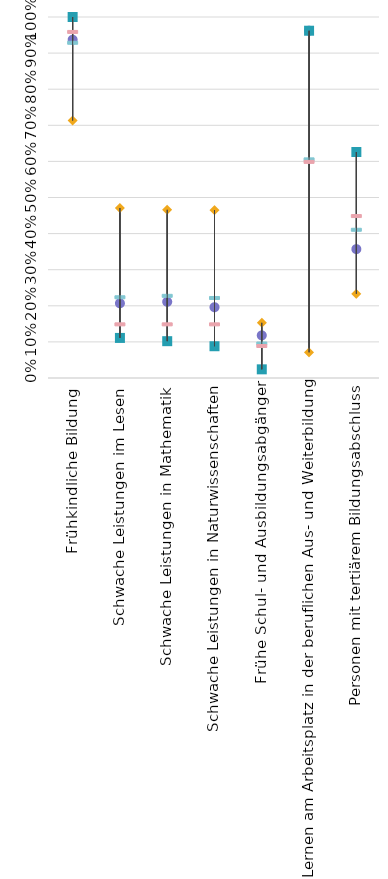
| Category | 93.7% | Strongest performer | Weakest performer | EU average | EU target |
|---|---|---|---|---|---|
| Frühkindliche Bildung | 0.937 | 1 | 0.713 | 0.93 | 0.96 |
| Schwache Leistungen im Lesen | 0.207 | 0.111 | 0.471 | 0.225 | 0.15 |
| Schwache Leistungen in Mathematik | 0.211 | 0.102 | 0.466 | 0.229 | 0.15 |
| Schwache Leistungen in Naturwissenschaften | 0.196 | 0.088 | 0.465 | 0.223 | 0.15 |
| Frühe Schul- und Ausbildungsabgänger | 0.118 | 0.024 | 0.153 | 0.097 | 0.09 |
| Lernen am Arbeitsplatz in der beruflichen Aus- und Weiterbildung | 0.962 | 0.962 | 0.071 | 0.607 | 0.6 |
| Personen mit tertiärem Bildungsabschluss | 0.357 | 0.626 | 0.233 | 0.412 | 0.45 |